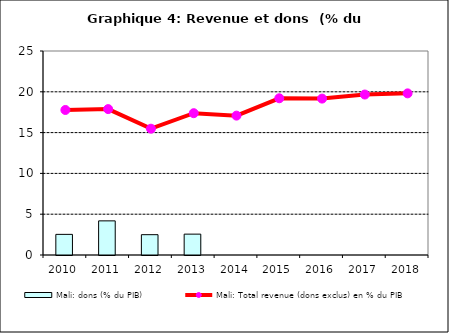
| Category | Mali: dons (% du PIB) |
|---|---|
| 2010.0 | 2.528 |
| 2011.0 | 4.183 |
| 2012.0 | 2.491 |
| 2013.0 | 2.557 |
| 2014.0 | 0 |
| 2015.0 | 0 |
| 2016.0 | 0 |
| 2017.0 | 0 |
| 2018.0 | 0 |